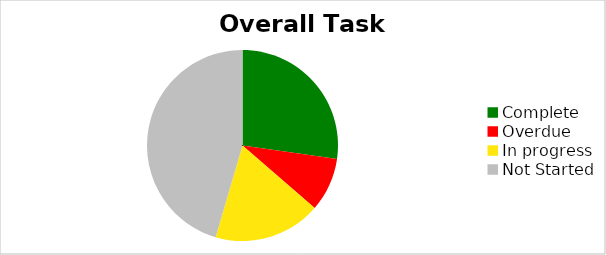
| Category | Series 0 |
|---|---|
| Complete | 0.273 |
| Overdue | 0.091 |
| In progress | 0.182 |
| Not Started | 0.455 |